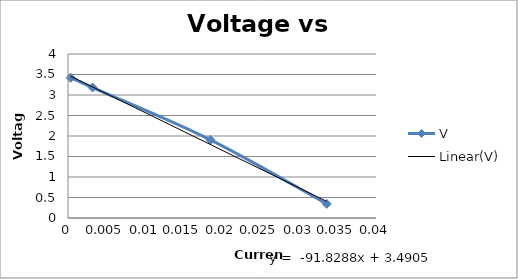
| Category | V |
|---|---|
| 0.033600000000000005 | 0.344 |
| 0.0185 | 1.906 |
| 0.00319 | 3.182 |
| 0.000347 | 3.421 |